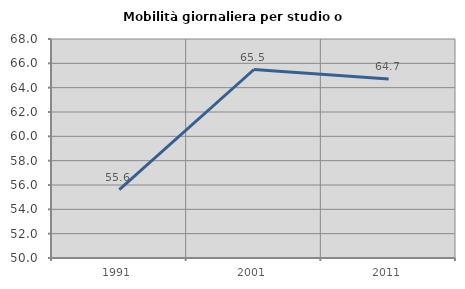
| Category | Mobilità giornaliera per studio o lavoro |
|---|---|
| 1991.0 | 55.625 |
| 2001.0 | 65.493 |
| 2011.0 | 64.706 |